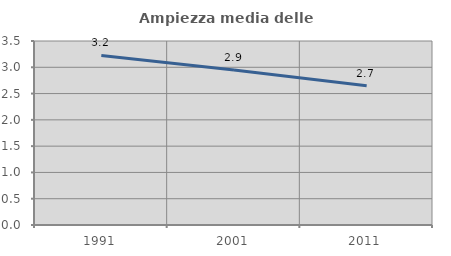
| Category | Ampiezza media delle famiglie |
|---|---|
| 1991.0 | 3.225 |
| 2001.0 | 2.946 |
| 2011.0 | 2.65 |